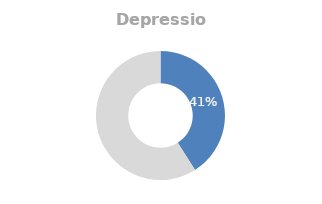
| Category | Depression |
|---|---|
| 0 | 0.41 |
| 1 | 0.59 |